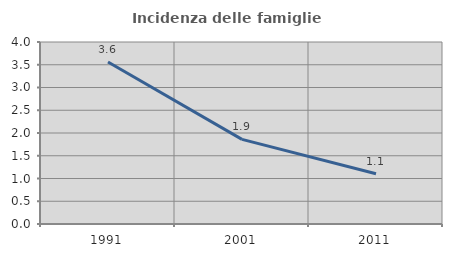
| Category | Incidenza delle famiglie numerose |
|---|---|
| 1991.0 | 3.559 |
| 2001.0 | 1.86 |
| 2011.0 | 1.104 |